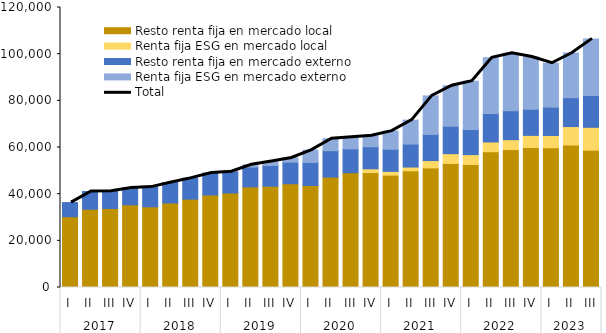
| Category | Resto renta fija en mercado local | Renta fija ESG en mercado local | Resto renta fija en mercado externo | Renta fija ESG en mercado externo |
|---|---|---|---|---|
| 0 | 30330.514 | 0 | 6066.402 | 0 |
| 1 | 33529.324 | 0 | 7613.391 | 0 |
| 2 | 33855.969 | 0 | 7422.033 | 0 |
| 3 | 35421.742 | 0 | 7249.072 | 0 |
| 4 | 34569.052 | 0 | 8458.116 | 0 |
| 5 | 36206.414 | 0 | 8789.8 | 0 |
| 6 | 37870.143 | 0 | 9000.144 | 0 |
| 7 | 39630.095 | 0 | 9398.295 | 0 |
| 8 | 40499.797 | 0 | 9099.034 | 0 |
| 9 | 43117.55 | 0 | 8492.145 | 967.097 |
| 10 | 43391.716 | 0 | 8908.401 | 1726.623 |
| 11 | 44466.717 | 0 | 9252.422 | 1797.298 |
| 12 | 43704.947 | 0 | 9909.414 | 5258.162 |
| 13 | 47318.233 | 0 | 11307.939 | 5146.389 |
| 14 | 49201.911 | 0 | 10198.1 | 5036.29 |
| 15 | 49255.301 | 1609.782 | 9454.35 | 4691.349 |
| 16 | 48144.166 | 1619.515 | 9497.794 | 7771.21 |
| 17 | 50010.575 | 1609.674 | 9835.528 | 10276.365 |
| 18 | 51248.983 | 3156.564 | 11207.056 | 16498.9 |
| 19 | 53165.079 | 4194.067 | 11762.027 | 17366.899 |
| 20 | 52708.631 | 4237.1 | 10762.025 | 20699.488 |
| 21 | 58187.092 | 4193.592 | 12197.557 | 23874.104 |
| 22 | 59120.993 | 4237.581 | 12433.366 | 24594.439 |
| 23 | 59991.129 | 5205.251 | 11172.802 | 22439.256 |
| 24 | 59895.639 | 5265.295 | 12162.115 | 18786.729 |
| 25 | 61076.323 | 7893.125 | 12382.706 | 19148.746 |
| 26 | 58864.895 | 9782.325 | 13626.815 | 24274.144 |